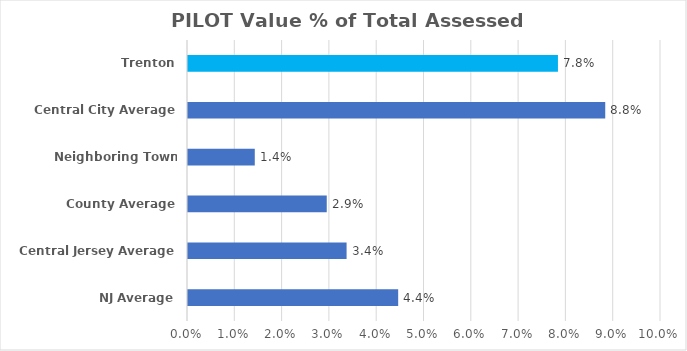
| Category | PILOT Value % of Total Assessed Value |
|---|---|
| NJ Average | 0.044 |
| Central Jersey Average | 0.034 |
| County Average | 0.029 |
| Neighboring Town Average | 0.014 |
| Central City Average | 0.088 |
| Trenton | 0.078 |